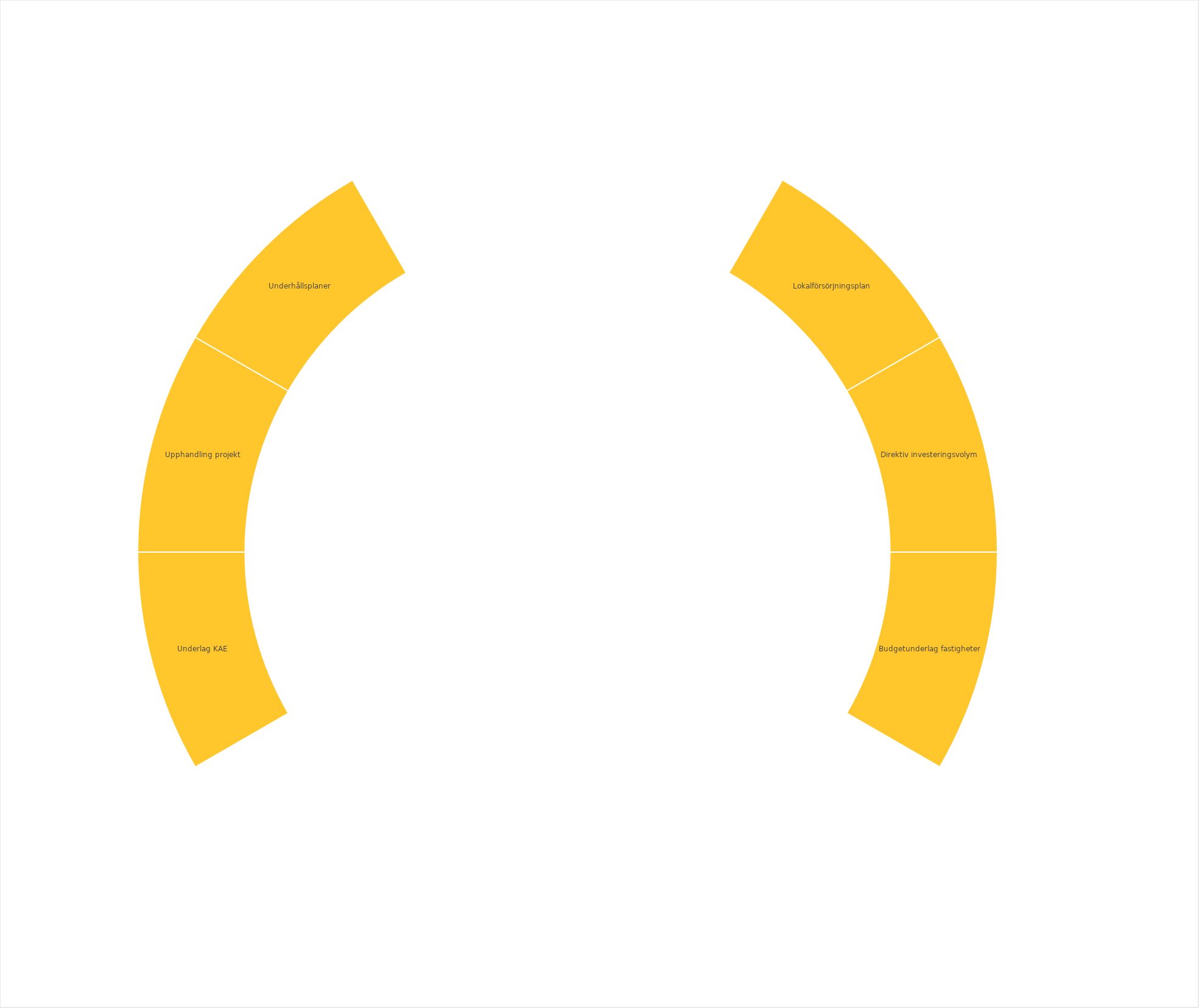
| Category | Series 0 |
|---|---|
|  | 1 |
| Lokalförsörjningsplan | 1 |
| Direktiv investeringsvolym | 1 |
| Budgetunderlag fastigheter | 1 |
|  | 1 |
|  | 1 |
|  | 1 |
|  | 1 |
| Underlag KAE | 1 |
| Upphandling projekt | 1 |
| Underhållsplaner | 1 |